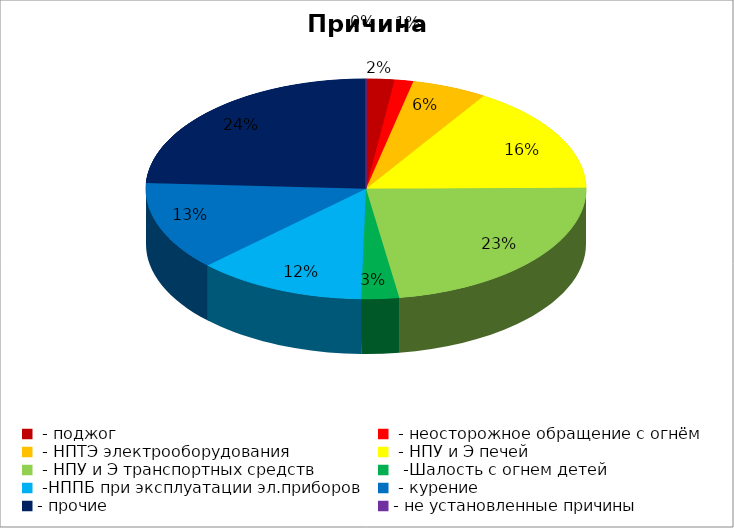
| Category | Причина пожара |
|---|---|
|  - поджог | 3 |
|  - неосторожное обращение с огнём | 2 |
|  - НПТЭ электрооборудования | 8 |
|  - НПУ и Э печей | 23 |
|  - НПУ и Э транспортных средств | 33 |
|   -Шалость с огнем детей | 4 |
|  -НППБ при эксплуатации эл.приборов | 18 |
|  - курение | 19 |
| - прочие | 35 |
| - не установленные причины | 0 |